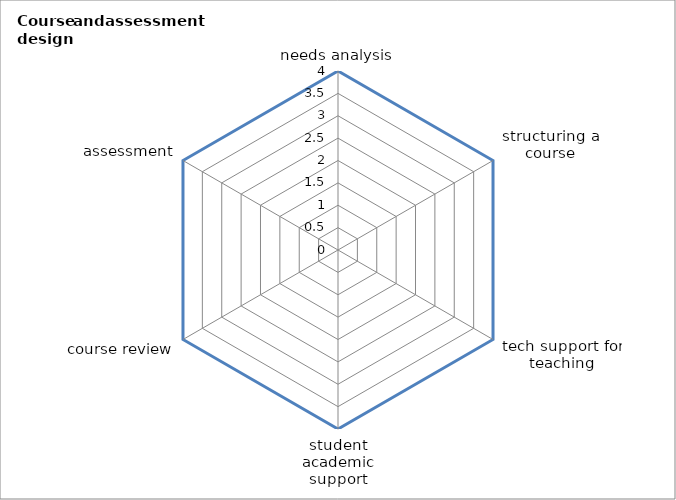
| Category | Series 0 | Series 1 |
|---|---|---|
| needs analysis | 4 |  |
| structuring a course | 4 |  |
| tech support for teaching | 4 |  |
| student academic support | 4 |  |
| course review | 4 |  |
| assessment | 4 |  |